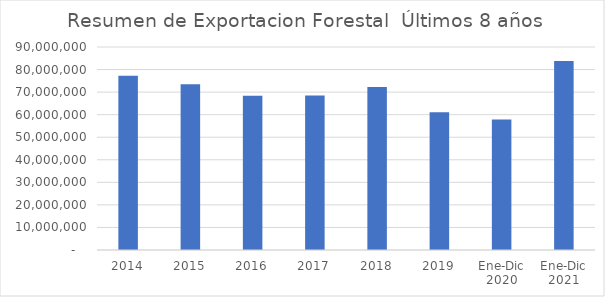
| Category | Series 0 |
|---|---|
| 2014 | 77204544.586 |
| 2015 | 73517987 |
| 2016 | 68416681 |
| 2017 | 68549860 |
| 2018 | 72269286 |
| 2019 | 61109740 |
| Ene-Dic 2020 | 57867278 |
| Ene-Dic 2021 | 83811692 |